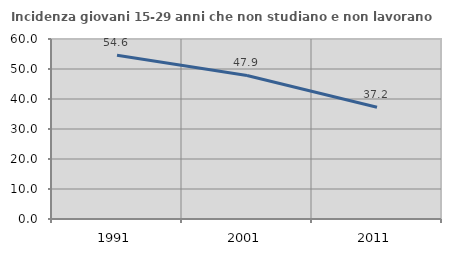
| Category | Incidenza giovani 15-29 anni che non studiano e non lavorano  |
|---|---|
| 1991.0 | 54.595 |
| 2001.0 | 47.858 |
| 2011.0 | 37.24 |